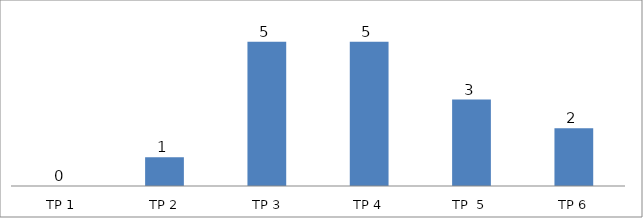
| Category | BIL. MURID |
|---|---|
| TP 1 | 0 |
| TP 2 | 1 |
|  TP 3 | 5 |
| TP 4 | 5 |
| TP  5 | 3 |
| TP 6 | 2 |